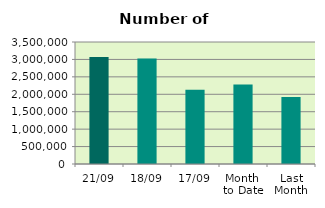
| Category | Series 0 |
|---|---|
| 21/09 | 3067952 |
| 18/09 | 3027358 |
| 17/09 | 2126546 |
| Month 
to Date | 2281117.067 |
| Last
Month | 1925290.095 |